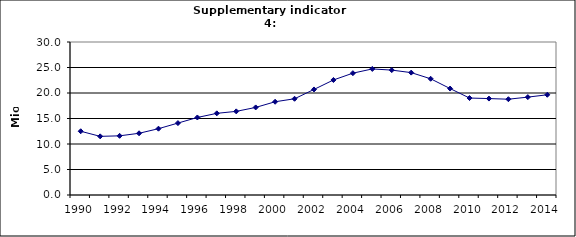
| Category | Domestic air-passengers, Mio |
|---|---|
| 1990 | 12.5 |
| 1991 | 11.5 |
| 1992 | 11.6 |
| 1993 | 12.1 |
| 1994 | 13 |
| 1995 | 14.1 |
| 1996 | 15.2 |
| 1997 | 16.013 |
| 1998 | 16.4 |
| 1999 | 17.17 |
| 2000 | 18.283 |
| 2001 | 18.867 |
| 2002 | 20.696 |
| 2003 | 22.553 |
| 2004 | 23.89 |
| 2005 | 24.719 |
| 2006 | 24.491 |
| 2007 | 23.997 |
| 2008 | 22.789 |
| 2009 | 20.87 |
| 2010 | 19.011 |
| 2011 | 18.909 |
| 2012 | 18.784 |
| 2013 | 19.192 |
| 2014 | 19.652 |